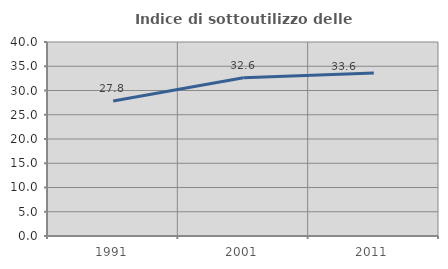
| Category | Indice di sottoutilizzo delle abitazioni  |
|---|---|
| 1991.0 | 27.833 |
| 2001.0 | 32.638 |
| 2011.0 | 33.586 |